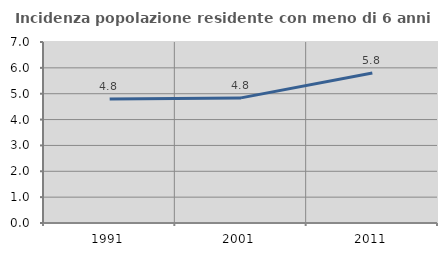
| Category | Incidenza popolazione residente con meno di 6 anni |
|---|---|
| 1991.0 | 4.793 |
| 2001.0 | 4.839 |
| 2011.0 | 5.803 |